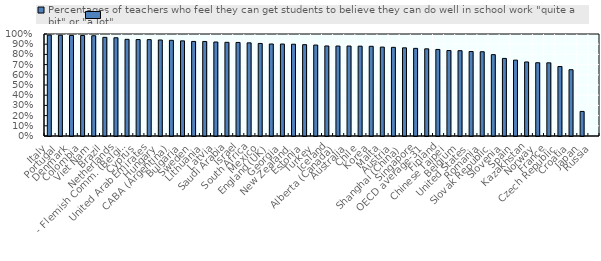
| Category | Percentages of teachers who feel they can get students to believe they can do well in school work "quite a bit" or "a lot" |
|---|---|
| Italy | 0.99 |
| Portugal | 0.988 |
| Denmark | 0.986 |
| Colombia | 0.985 |
| Viet Nam | 0.983 |
| Brazil | 0.967 |
| Netherlands | 0.963 |
|     - Flemish Comm. (Belgium) | 0.948 |
| Cyprus | 0.946 |
| United Arab Emirates | 0.945 |
| Hungary | 0.941 |
| CABA (Argentina) | 0.938 |
| Bulgaria | 0.933 |
| Sweden | 0.927 |
| Lithuania | 0.927 |
| Latvia | 0.922 |
| Saudi Arabia | 0.918 |
| Israel | 0.917 |
| South Africa | 0.913 |
| Mexico | 0.907 |
| England (UK) | 0.902 |
| Georgia | 0.902 |
| New Zealand | 0.9 |
| Estonia | 0.895 |
| Turkey | 0.892 |
| Iceland | 0.883 |
| Alberta (Canada) | 0.882 |
| Australia | 0.882 |
| Chile | 0.881 |
| Korea | 0.879 |
| Malta | 0.872 |
| Austria | 0.869 |
| Shanghai (China) | 0.864 |
| Singapore | 0.859 |
| OECD average-31 | 0.855 |
| Finland | 0.849 |
| Chinese Taipei | 0.838 |
| Belgium | 0.837 |
| United States | 0.828 |
| Romania | 0.826 |
| Slovak Republic | 0.798 |
| Slovenia | 0.761 |
| Spain | 0.744 |
| Kazakhstan | 0.726 |
| Norway | 0.718 |
| France | 0.718 |
| Czech Republic | 0.681 |
| Croatia | 0.65 |
| Japan | 0.241 |
| Russia | 0 |